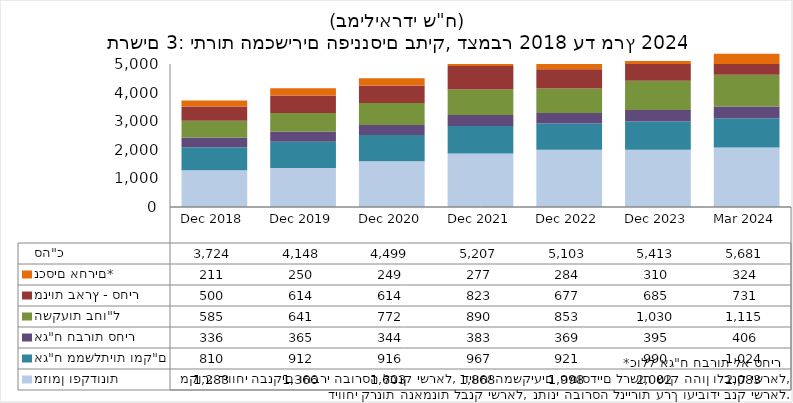
| Category | מזומן ופקדונות | אג"ח ממשלתיות ומק"ם | אג"ח חברות סחיר | השקעות בחו"ל | מניות בארץ - סחיר | נכסים אחרים* | סה"כ |
|---|---|---|---|---|---|---|---|
| 2018-12-31 | 1283.26 | 809.81 | 335.75 | 584.7 | 499.59 | 211.19 | 3724.3 |
| 2019-12-31 | 1365.73 | 911.91 | 365.33 | 641.01 | 614.38 | 249.97 | 4148.33 |
| 2020-12-31 | 1603.4 | 916.09 | 344.34 | 772.48 | 613.6 | 248.61 | 4498.52 |
| 2021-12-31 | 1867.92 | 967.44 | 383.05 | 889.69 | 822.75 | 276.62 | 5207.47 |
| 2022-12-31 | 1998.01 | 920.92 | 368.98 | 853.14 | 677.21 | 284.29 | 5102.55 |
| 2023-12-31 | 2002.3 | 990.08 | 395.22 | 1029.82 | 685.3 | 310.02 | 5412.74 |
| 2024-03-31 | 2082.79 | 1023.58 | 405.79 | 1114.6 | 731 | 323.68 | 5681.44 |